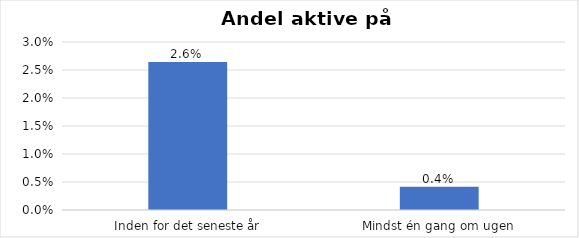
| Category | % |
|---|---|
| Inden for det seneste år | 0.026 |
| Mindst én gang om ugen | 0.004 |